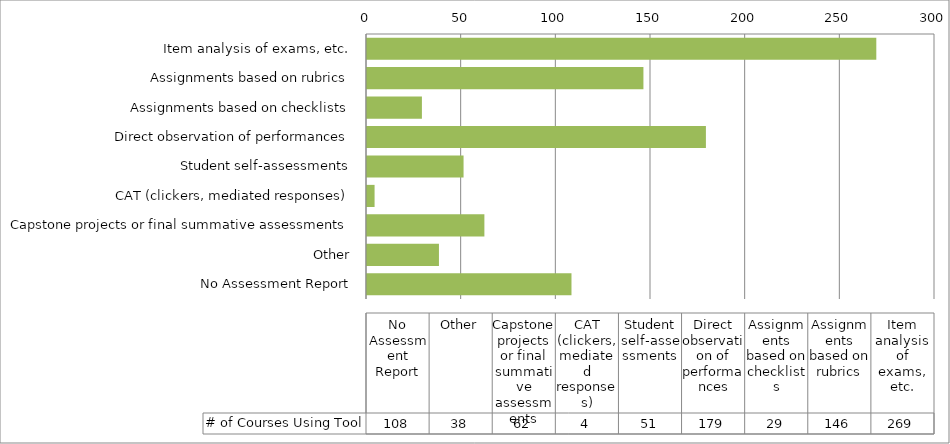
| Category | # of Courses Using Tool |
|---|---|
| Item analysis of exams, etc. | 269 |
| Assignments based on rubrics | 146 |
| Assignments based on checklists | 29 |
| Direct observation of performances | 179 |
| Student self-assessments | 51 |
| CAT (clickers, mediated responses) | 4 |
| Capstone projects or final summative assessments | 62 |
| Other | 38 |
| No Assessment Report | 108 |